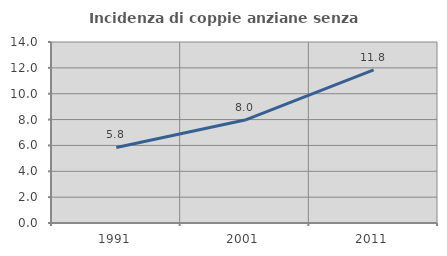
| Category | Incidenza di coppie anziane senza figli  |
|---|---|
| 1991.0 | 5.847 |
| 2001.0 | 7.961 |
| 2011.0 | 11.846 |